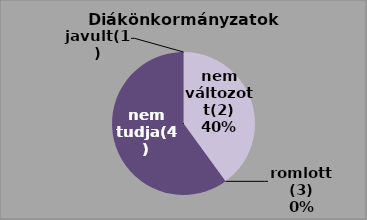
| Category | Series 0 | Series 1 |
|---|---|---|
| javult(1) | 0 | 0 |
| nem változott(2) | 10 | 40 |
| romlott(3) | 0 | 0 |
| nem tudja(4) | 15 | 60 |